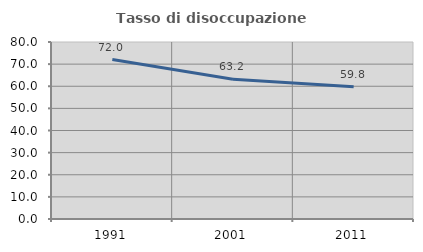
| Category | Tasso di disoccupazione giovanile  |
|---|---|
| 1991.0 | 72.047 |
| 2001.0 | 63.19 |
| 2011.0 | 59.828 |